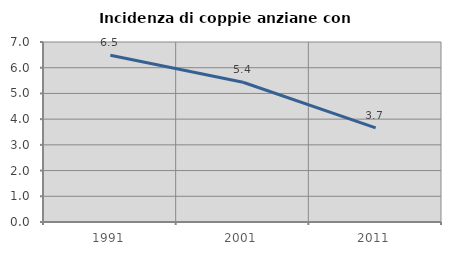
| Category | Incidenza di coppie anziane con figli |
|---|---|
| 1991.0 | 6.481 |
| 2001.0 | 5.435 |
| 2011.0 | 3.659 |